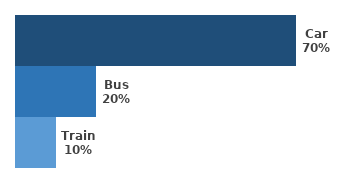
| Category | Series 0 |
|---|---|
| Car | 0.7 |
| Bus | 0.2 |
| Train | 0.1 |